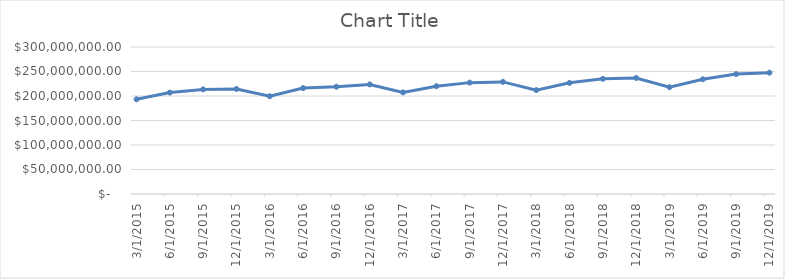
| Category | Series 0 |
|---|---|
| 3/1/15 | 193214760.65 |
| 6/1/15 | 206971890.35 |
| 9/1/15 | 213490881.83 |
| 12/1/15 | 214349105.84 |
| 3/1/16 | 199493745.37 |
| 6/1/16 | 216148419.22 |
| 9/1/16 | 218976889.8 |
| 12/1/16 | 223617895.79 |
| 3/1/17 | 207333812.45 |
| 6/1/17 | 219981727.55 |
| 9/1/17 | 227293496.76 |
| 12/1/17 | 228775828.16 |
| 3/1/18 | 212038702.39 |
| 6/1/18 | 226827967.75 |
| 9/1/18 | 235037993.57 |
| 12/1/18 | 236774885.37 |
| 3/1/19 | 217929233.04 |
| 6/1/19 | 234134611.36 |
| 9/1/19 | 244715476.07 |
| 12/1/19 | 247579099.134 |